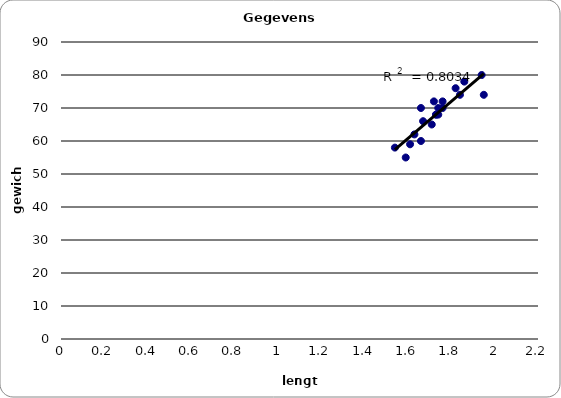
| Category | Series 0 |
|---|---|
| 1.95 | 74 |
| 1.61 | 59 |
| 1.63 | 62 |
| 1.74 | 70 |
| 1.54 | 58 |
| 1.67 | 66 |
| 1.82 | 76 |
| 1.86 | 78 |
| 1.66 | 60 |
| 1.71 | 65 |
| 1.94 | 80 |
| 1.76 | 72 |
| 1.76 | 70 |
| 1.84 | 74 |
| 1.74 | 68 |
| 1.73 | 68 |
| 1.59 | 55 |
| 1.72 | 72 |
| 1.66 | 70 |
| 1.73 | 68 |